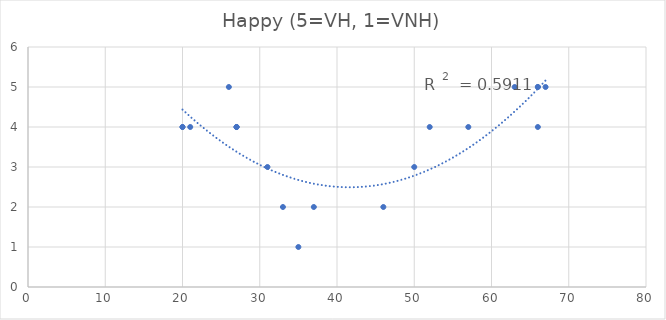
| Category | Happy (5=VH, 1=VNH) |
|---|---|
| 67.0 | 5 |
| 26.0 | 5 |
| 57.0 | 4 |
| 20.0 | 4 |
| 37.0 | 2 |
| 35.0 | 1 |
| 21.0 | 4 |
| 50.0 | 3 |
| 63.0 | 5 |
| 20.0 | 4 |
| 66.0 | 5 |
| 52.0 | 4 |
| 27.0 | 4 |
| 46.0 | 2 |
| 31.0 | 3 |
| 27.0 | 4 |
| 66.0 | 4 |
| 27.0 | 4 |
| 33.0 | 2 |
| 66.0 | 5 |